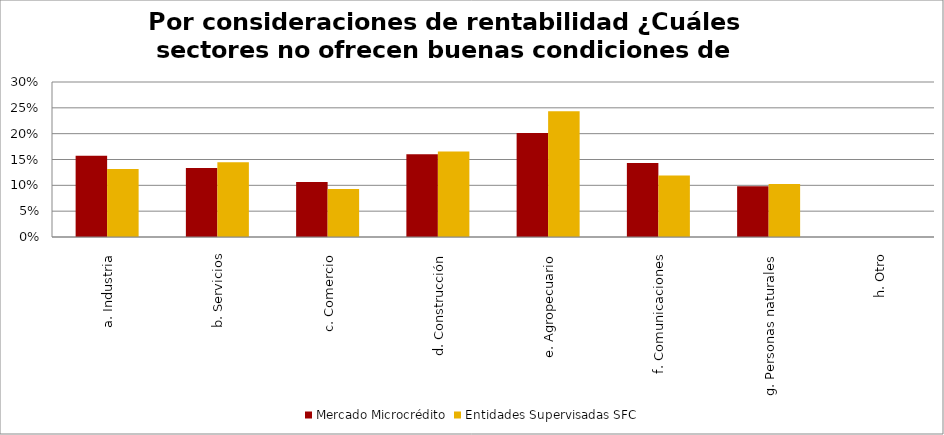
| Category | Mercado Microcrédito | Entidades Supervisadas SFC |
|---|---|---|
| a. Industria | 0.157 | 0.132 |
| b. Servicios | 0.134 | 0.145 |
| c. Comercio | 0.107 | 0.093 |
| d. Construcción | 0.16 | 0.166 |
| e. Agropecuario | 0.201 | 0.243 |
| f. Comunicaciones | 0.143 | 0.119 |
| g. Personas naturales | 0.098 | 0.103 |
| h. Otro | 0 | 0 |